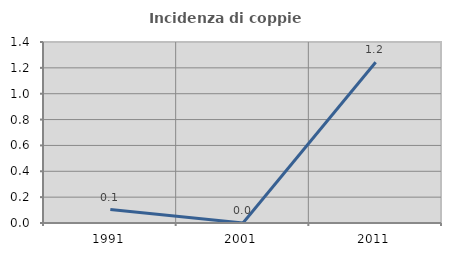
| Category | Incidenza di coppie miste |
|---|---|
| 1991.0 | 0.104 |
| 2001.0 | 0 |
| 2011.0 | 1.244 |